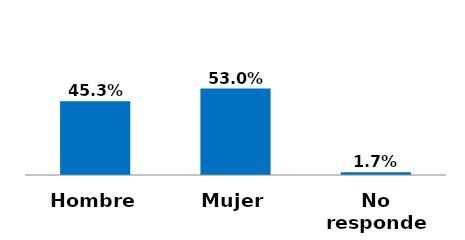
| Category | Series 0 |
|---|---|
| Hombre | 0.453 |
| Mujer | 0.53 |
| No responde | 0.017 |